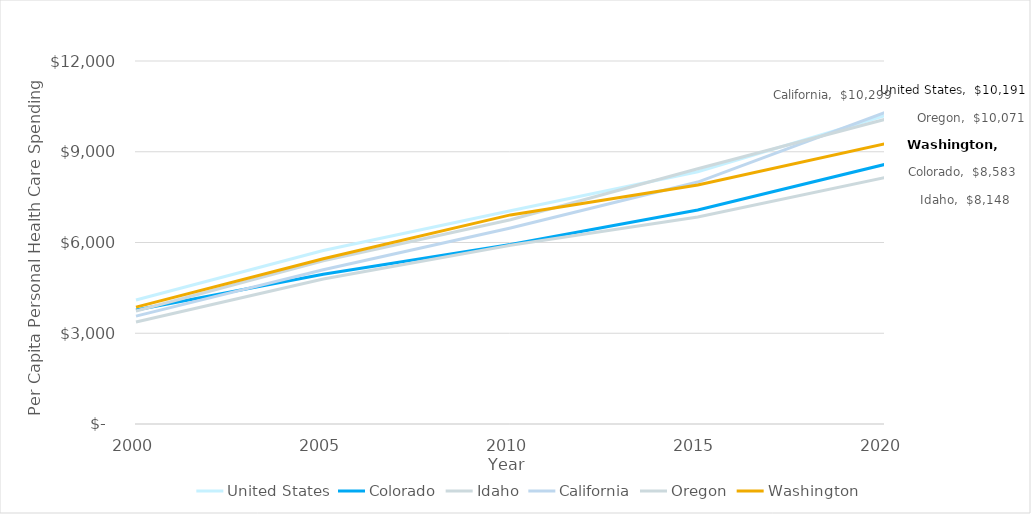
| Category | United States | Colorado | Idaho | California | Oregon | Washington |
|---|---|---|---|---|---|---|
| 2000 | 4101 | 3767 | 3372 | 3567 | 3734 | 3863 |
| 2005 | 5734 | 4952 | 4793 | 5097 | 5395 | 5462 |
| 2010 | 7052 | 5932 | 5909 | 6480 | 6750 | 6912 |
| 2015 | 8337 | 7075 | 6843 | 7998 | 8438 | 7904 |
| 2020 | 10191 | 8583 | 8148 | 10299 | 10071 | 9265 |